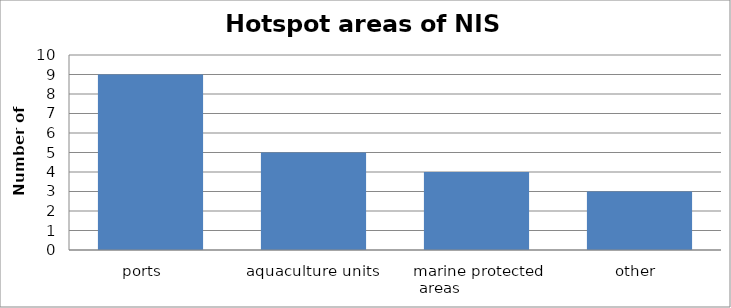
| Category | Member States |
|---|---|
| ports    | 9 |
| aquaculture units | 5 |
| marine protected areas                 | 4 |
| other  | 3 |